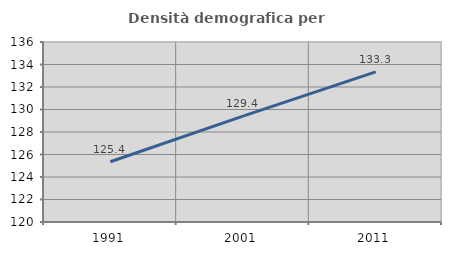
| Category | Densità demografica |
|---|---|
| 1991.0 | 125.352 |
| 2001.0 | 129.415 |
| 2011.0 | 133.345 |